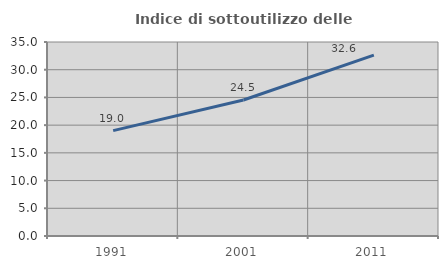
| Category | Indice di sottoutilizzo delle abitazioni  |
|---|---|
| 1991.0 | 19.011 |
| 2001.0 | 24.542 |
| 2011.0 | 32.639 |